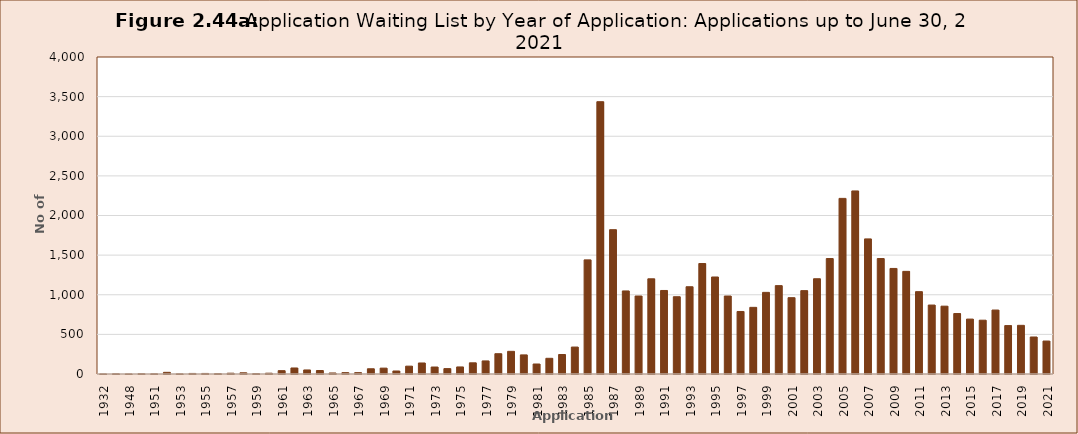
| Category | Series 0 |
|---|---|
| 1932.0 | 1 |
| 1947.0 | 3 |
| 1948.0 | 1 |
| 1950.0 | 4 |
| 1951.0 | 3 |
| 1952.0 | 21 |
| 1953.0 | 2 |
| 1954.0 | 7 |
| 1955.0 | 7 |
| 1956.0 | 5 |
| 1957.0 | 10 |
| 1958.0 | 15 |
| 1959.0 | 5 |
| 1960.0 | 10 |
| 1961.0 | 42 |
| 1962.0 | 76 |
| 1963.0 | 51 |
| 1964.0 | 44 |
| 1965.0 | 13 |
| 1966.0 | 17 |
| 1967.0 | 17 |
| 1968.0 | 66 |
| 1969.0 | 74 |
| 1970.0 | 38 |
| 1971.0 | 99 |
| 1972.0 | 139 |
| 1973.0 | 88 |
| 1974.0 | 68 |
| 1975.0 | 89 |
| 1976.0 | 141 |
| 1977.0 | 165 |
| 1978.0 | 256 |
| 1979.0 | 286 |
| 1980.0 | 241 |
| 1981.0 | 126 |
| 1982.0 | 198 |
| 1983.0 | 246 |
| 1984.0 | 340 |
| 1985.0 | 1440 |
| 1986.0 | 3436 |
| 1987.0 | 1821 |
| 1988.0 | 1048 |
| 1989.0 | 984 |
| 1990.0 | 1201 |
| 1991.0 | 1054 |
| 1992.0 | 975 |
| 1993.0 | 1101 |
| 1994.0 | 1394 |
| 1995.0 | 1224 |
| 1996.0 | 984 |
| 1997.0 | 789 |
| 1998.0 | 841 |
| 1999.0 | 1030 |
| 2000.0 | 1115 |
| 2001.0 | 963 |
| 2002.0 | 1052 |
| 2003.0 | 1202 |
| 2004.0 | 1457 |
| 2005.0 | 2216 |
| 2006.0 | 2310 |
| 2007.0 | 1705 |
| 2008.0 | 1457 |
| 2009.0 | 1332 |
| 2010.0 | 1295 |
| 2011.0 | 1039 |
| 2012.0 | 870 |
| 2013.0 | 856 |
| 2014.0 | 763 |
| 2015.0 | 693 |
| 2016.0 | 679 |
| 2017.0 | 807 |
| 2018.0 | 611 |
| 2019.0 | 614 |
| 2020.0 | 467 |
| 2021.0 | 416 |